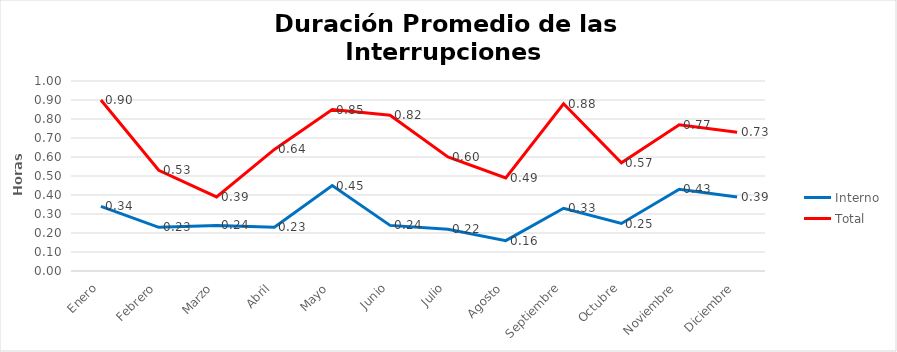
| Category | Interno | Total |
|---|---|---|
| Enero | 0.34 | 0.9 |
| Febrero | 0.23 | 0.53 |
| Marzo | 0.24 | 0.39 |
| Abril | 0.23 | 0.64 |
| Mayo | 0.45 | 0.85 |
| Junio | 0.24 | 0.82 |
| Julio | 0.22 | 0.6 |
| Agosto | 0.16 | 0.49 |
| Septiembre | 0.33 | 0.88 |
| Octubre | 0.25 | 0.57 |
| Noviembre | 0.43 | 0.77 |
| Diciembre | 0.39 | 0.73 |